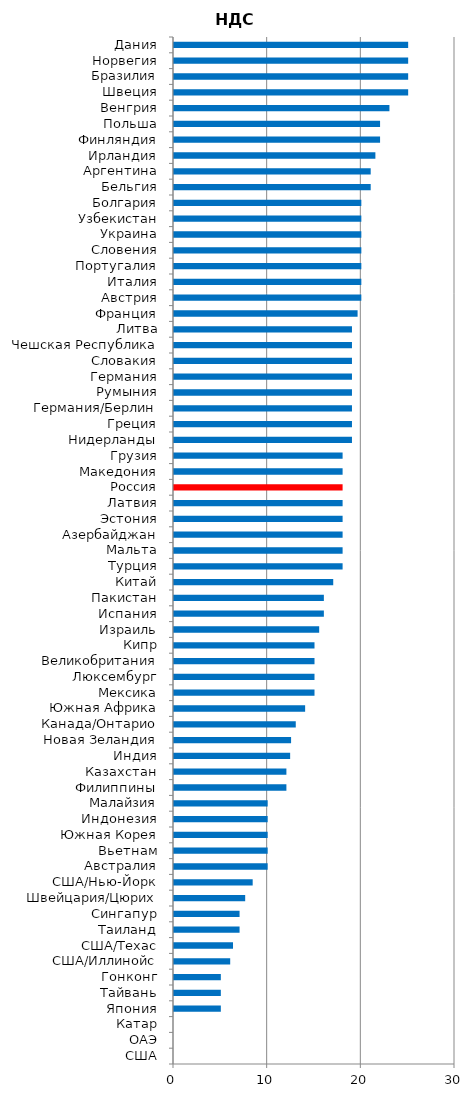
| Category | НДС |
|---|---|
| США | 0 |
| ОАЭ | 0 |
| Катар | 0 |
| Япония | 5 |
| Тайвань | 5 |
| Гонконг | 5 |
| США/Иллинойс | 6 |
| США/Техас | 6.3 |
| Таиланд | 7 |
| Сингапур | 7 |
| Швейцария/Цюрих | 7.6 |
| США/Нью-Йорк | 8.4 |
| Австралия | 10 |
| Вьетнам | 10 |
| Южная Корея | 10 |
| Индонезия | 10 |
| Малайзия | 10 |
| Филиппины | 12 |
| Казахстан | 12 |
| Индия | 12.4 |
| Новая Зеландия | 12.5 |
| Канада/Онтарио | 13 |
| Южная Африка | 14 |
| Мексика | 15 |
| Люксембург | 15 |
| Великобритания | 15 |
| Кипр | 15 |
| Израиль | 15.5 |
| Испания | 16 |
| Пакистан | 16 |
| Китай | 17 |
| Турция | 18 |
| Мальта | 18 |
| Азербайджан | 18 |
| Эстония | 18 |
| Латвия | 18 |
| Россия | 18 |
| Македония | 18 |
| Грузия | 18 |
| Нидерланды | 19 |
| Греция | 19 |
| Германия/Берлин | 19 |
| Румыния | 19 |
| Германия | 19 |
| Словакия | 19 |
| Чешская Республика | 19 |
| Литва | 19 |
| Франция | 19.6 |
| Австрия | 20 |
| Италия | 20 |
| Португалия | 20 |
| Словения | 20 |
| Украина | 20 |
| Узбекистан | 20 |
| Болгария | 20 |
| Бельгия | 21 |
| Аргентина | 21 |
| Ирландия | 21.5 |
| Финляндия | 22 |
| Польша | 22 |
| Венгрия | 23 |
| Швеция | 25 |
| Бразилия | 25 |
| Норвегия | 25 |
| Дания | 25 |